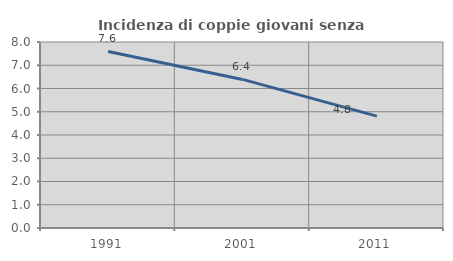
| Category | Incidenza di coppie giovani senza figli |
|---|---|
| 1991.0 | 7.595 |
| 2001.0 | 6.391 |
| 2011.0 | 4.811 |